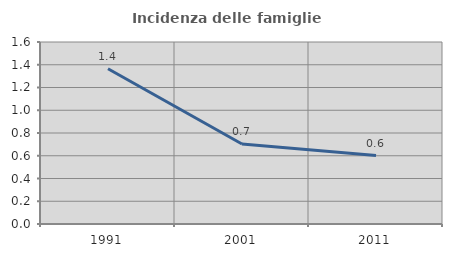
| Category | Incidenza delle famiglie numerose |
|---|---|
| 1991.0 | 1.365 |
| 2001.0 | 0.703 |
| 2011.0 | 0.602 |